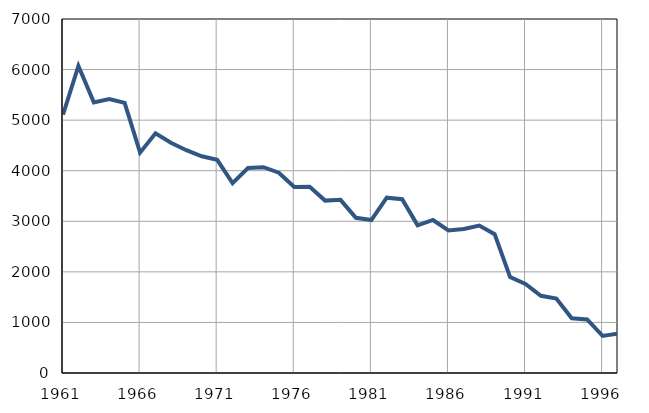
| Category | Infants
deaths |
|---|---|
| 1961.0 | 5108 |
| 1962.0 | 6072 |
| 1963.0 | 5351 |
| 1964.0 | 5418 |
| 1965.0 | 5341 |
| 1966.0 | 4357 |
| 1967.0 | 4739 |
| 1968.0 | 4552 |
| 1969.0 | 4405 |
| 1970.0 | 4286 |
| 1971.0 | 4215 |
| 1972.0 | 3753 |
| 1973.0 | 4053 |
| 1974.0 | 4069 |
| 1975.0 | 3961 |
| 1976.0 | 3678 |
| 1977.0 | 3681 |
| 1978.0 | 3409 |
| 1979.0 | 3424 |
| 1980.0 | 3069 |
| 1981.0 | 3024 |
| 1982.0 | 3466 |
| 1983.0 | 3437 |
| 1984.0 | 2921 |
| 1985.0 | 3026 |
| 1986.0 | 2819 |
| 1987.0 | 2848 |
| 1988.0 | 2916 |
| 1989.0 | 2745 |
| 1990.0 | 1897 |
| 1991.0 | 1761 |
| 1992.0 | 1526 |
| 1993.0 | 1471 |
| 1994.0 | 1081 |
| 1995.0 | 1058 |
| 1996.0 | 734 |
| 1997.0 | 781 |